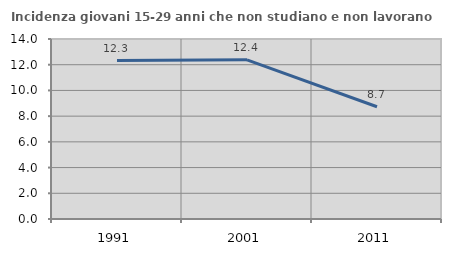
| Category | Incidenza giovani 15-29 anni che non studiano e non lavorano  |
|---|---|
| 1991.0 | 12.319 |
| 2001.0 | 12.377 |
| 2011.0 | 8.729 |